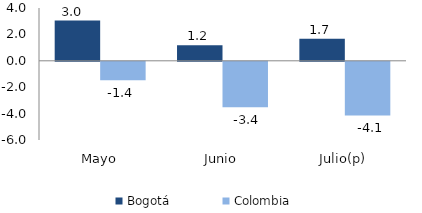
| Category | Bogotá | Colombia |
|---|---|---|
| Mayo | 3.045 | -1.4 |
| Junio | 1.177 | -3.445 |
| Julio(p) | 1.665 | -4.063 |